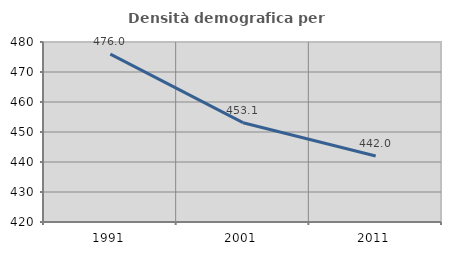
| Category | Densità demografica |
|---|---|
| 1991.0 | 475.956 |
| 2001.0 | 453.104 |
| 2011.0 | 442.01 |